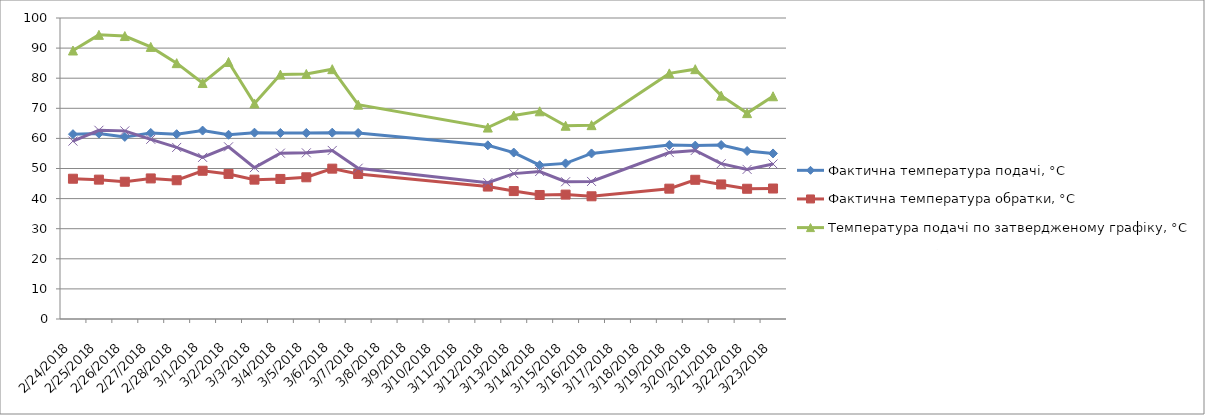
| Category | Фактична температура подачі, °С | Фактична температура обратки, °С | Температура подачі по затвердженому графіку, °С | Температура обратки по затвердженому графіку, °С |
|---|---|---|---|---|
| 2/24/18 | 61.4 | 46.6 | 89.2 | 59.1 |
| 2/25/18 | 61.6 | 46.3 | 94.4 | 62.7 |
| 2/26/18 | 60.5 | 45.6 | 94 | 62.5 |
| 2/27/18 | 61.8 | 46.7 | 90.4 | 59.7 |
| 2/28/18 | 61.4 | 46.1 | 85 | 57 |
| 3/1/18 | 62.6 | 49.25 | 78.4 | 53.7 |
| 3/2/18 | 61.2 | 48.2 | 85.4 | 57.2 |
| 3/3/18 | 61.9 | 46.3 | 71.6 | 50.3 |
| 3/4/18 | 61.8 | 46.53 | 81.2 | 55.1 |
| 3/5/18 | 61.8 | 47.08 | 81.4 | 55.2 |
| 3/6/18 | 61.9 | 49.95 | 83 | 56 |
| 3/7/18 | 61.8 | 48.18 | 71.2 | 50.1 |
| 3/12/18 | 57.7 | 44 | 63.6 | 45.3 |
| 3/13/18 | 55.3 | 42.5 | 67.6 | 48.3 |
| 3/14/18 | 51.1 | 41.2 | 69 | 49 |
| 3/15/18 | 51.7 | 41.33 | 64.2 | 45.6 |
| 3/16/18 | 55 | 40.77 | 64.4 | 45.7 |
| 3/19/18 | 57.8 | 43.3 | 81.6 | 55.3 |
| 3/20/18 | 57.6 | 46.25 | 83 | 56 |
| 3/21/18 | 57.8 | 44.7 | 74.2 | 51.6 |
| 3/22/18 | 55.8 | 43.27 | 68.4 | 49.7 |
| 3/23/18 | 55 | 43.35 | 74 | 51.5 |